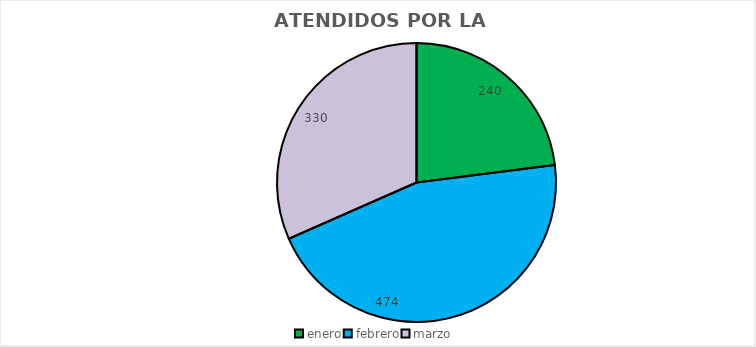
| Category | ATENDIDOS POR LA UAC |
|---|---|
| enero | 240 |
| febrero | 474 |
| marzo | 330 |